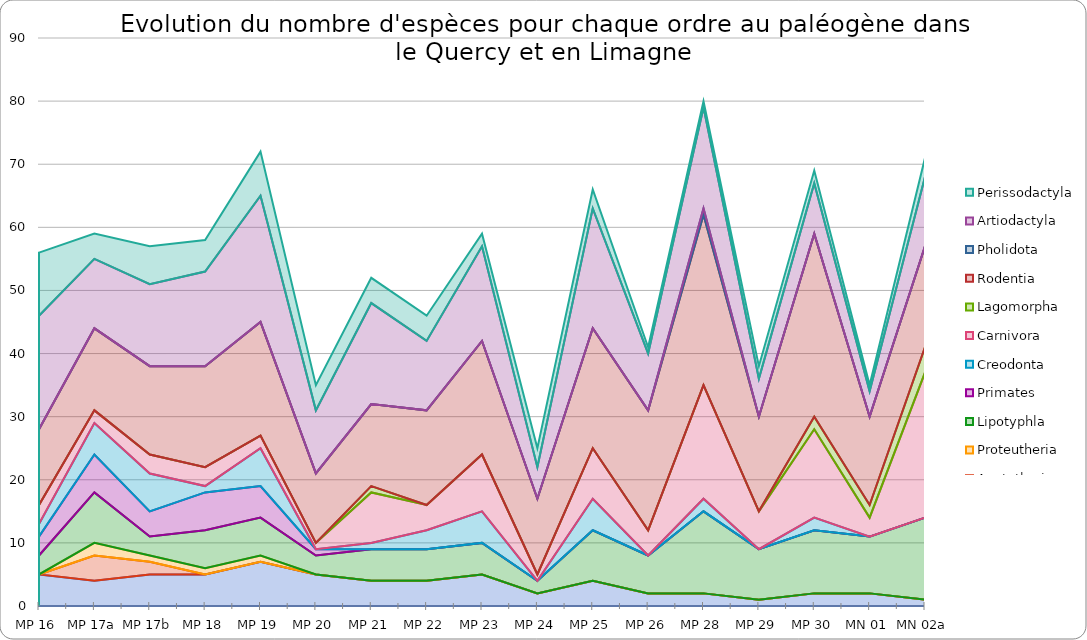
| Category | Didelphimorphia | Apatotheria | Proteutheria | Lipotyphla | Primates | Creodonta | Carnivora | Lagomorpha | Rodentia | Pholidota | Artiodactyla | Perissodactyla |
|---|---|---|---|---|---|---|---|---|---|---|---|---|
| MP 16 | 5 | 0 | 0 | 3 | 3 | 2 | 3 | 0 | 12 | 0 | 18 | 10 |
| MP 17a | 4 | 4 | 2 | 8 | 6 | 5 | 2 | 0 | 13 | 0 | 11 | 4 |
| MP 17b | 5 | 2 | 1 | 3 | 4 | 6 | 3 | 0 | 14 | 0 | 13 | 6 |
| MP 18 | 5 | 0 | 1 | 6 | 6 | 1 | 3 | 0 | 16 | 0 | 15 | 5 |
| MP 19 | 7 | 0 | 1 | 6 | 5 | 6 | 2 | 0 | 18 | 0 | 20 | 7 |
| MP 20 | 5 | 0 | 0 | 3 | 1 | 0 | 1 | 0 | 11 | 0 | 10 | 4 |
| MP 21 | 4 | 0 | 0 | 5 | 0 | 1 | 8 | 1 | 13 | 0 | 16 | 4 |
| MP 22 | 4 | 0 | 0 | 5 | 0 | 3 | 4 | 0 | 15 | 0 | 11 | 4 |
| MP 23 | 5 | 0 | 0 | 5 | 0 | 5 | 9 | 0 | 18 | 0 | 15 | 2 |
| MP 24 | 2 | 0 | 0 | 2 | 0 | 0 | 1 | 0 | 12 | 0 | 5 | 3 |
| MP 25 | 4 | 0 | 0 | 8 | 0 | 5 | 8 | 0 | 19 | 0 | 19 | 3 |
| MP 26 | 2 | 0 | 0 | 6 | 0 | 0 | 4 | 0 | 19 | 0 | 9 | 1 |
| MP 28 | 2 | 0 | 0 | 13 | 0 | 2 | 18 | 0 | 27 | 1 | 16 | 1 |
| MP 29 | 1 | 0 | 0 | 8 | 0 | 0 | 6 | 0 | 15 | 0 | 6 | 2 |
| MP 30 | 2 | 0 | 0 | 10 | 0 | 2 | 14 | 2 | 29 | 0 | 8 | 2 |
| MN 01 | 2 | 0 | 0 | 9 | 0 | 0 | 3 | 2 | 14 | 0 | 4 | 1 |
| MN 02a | 1 | 0 | 0 | 13 | 0 | 0 | 23 | 4 | 16 | 0 | 11 | 3 |